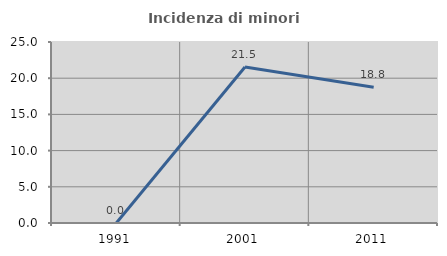
| Category | Incidenza di minori stranieri |
|---|---|
| 1991.0 | 0 |
| 2001.0 | 21.538 |
| 2011.0 | 18.75 |